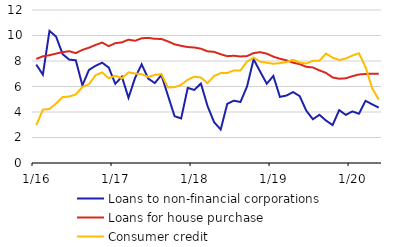
| Category | Loans to non-financial corporations | Loans for house purchase | Consumer credit |
|---|---|---|---|
|  1/16 | 7.719 | 8.163 | 2.96 |
| 2 | 6.928 | 8.368 | 4.184 |
| 3 | 10.362 | 8.454 | 4.237 |
| 4 | 9.918 | 8.583 | 4.663 |
| 5 | 8.537 | 8.692 | 5.171 |
| 6 | 8.109 | 8.768 | 5.214 |
| 7 | 8.057 | 8.617 | 5.377 |
| 8 | 6.09 | 8.871 | 5.965 |
| 9 | 7.299 | 9.044 | 6.179 |
| 10 | 7.625 | 9.26 | 6.887 |
| 11 | 7.866 | 9.446 | 7.103 |
| 12 | 7.485 | 9.166 | 6.655 |
|  1/17 | 6.213 | 9.397 | 6.847 |
| 2 | 6.765 | 9.463 | 6.648 |
| 3 | 5.115 | 9.671 | 7.111 |
| 4 | 6.673 | 9.588 | 7.018 |
| 5 | 7.74 | 9.782 | 6.965 |
| 6 | 6.618 | 9.815 | 6.745 |
| 7 | 6.269 | 9.74 | 6.909 |
| 8 | 6.902 | 9.729 | 6.978 |
| 9 | 5.281 | 9.537 | 5.921 |
| 10 | 3.669 | 9.308 | 5.949 |
| 11 | 3.496 | 9.188 | 6.133 |
| 12 | 5.891 | 9.094 | 6.528 |
|  1/18 | 5.728 | 9.059 | 6.772 |
| 2 | 6.234 | 8.964 | 6.704 |
| 3 | 4.475 | 8.76 | 6.263 |
| 4 | 3.204 | 8.718 | 6.82 |
| 5 | 2.625 | 8.532 | 7.051 |
| 6 | 4.638 | 8.379 | 7.065 |
| 7 | 4.89 | 8.413 | 7.26 |
| 8 | 4.785 | 8.355 | 7.247 |
| 9 | 5.993 | 8.384 | 7.95 |
| 10 | 8.137 | 8.622 | 8.271 |
| 11 | 7.165 | 8.691 | 7.942 |
| 12 | 6.217 | 8.578 | 7.867 |
|  1/19 | 6.825 | 8.341 | 7.783 |
| 2 | 5.184 | 8.179 | 7.832 |
| 3 | 5.293 | 8.052 | 7.921 |
| 4 | 5.561 | 7.865 | 8.096 |
| 5 | 5.245 | 7.758 | 7.872 |
| 6 | 4.106 | 7.542 | 7.8 |
| 7 | 3.433 | 7.497 | 8.014 |
| 8 | 3.78 | 7.263 | 8.026 |
| 9 | 3.328 | 7.065 | 8.582 |
| 10 | 2.975 | 6.712 | 8.265 |
| 11 | 4.148 | 6.61 | 8.079 |
| 12 | 3.774 | 6.644 | 8.193 |
|  1/20 | 4.044 | 6.808 | 8.429 |
| 2 | 3.864 | 6.944 | 8.607 |
| 3 | 4.875 | 6.98 | 7.526 |
| 4 | 4.604 | 7.006 | 5.865 |
| 5 | 4.349 | 6.993 | 4.976 |